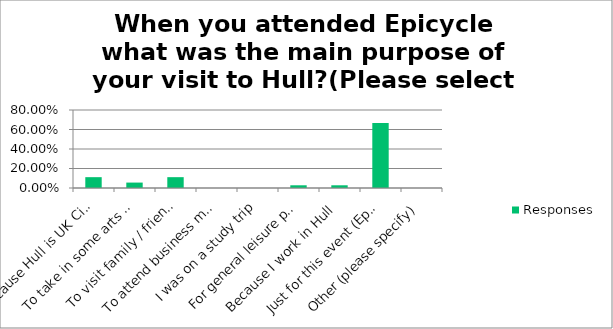
| Category | Responses |
|---|---|
| Because Hull is UK City of Culture 2017 | 0.111 |
| To take in some arts / heritage / culture generally | 0.056 |
| To visit family / friends | 0.111 |
| To attend business meetings or a conference although I normally work outside Hull | 0 |
| I was on a study trip | 0 |
| For general leisure purposes – shopping and eating out | 0.028 |
| Because I work in Hull | 0.028 |
| Just for this event (Epicycle) | 0.667 |
| Other (please specify) | 0 |